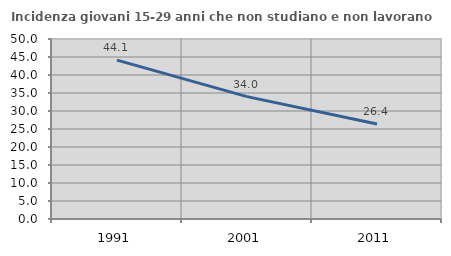
| Category | Incidenza giovani 15-29 anni che non studiano e non lavorano  |
|---|---|
| 1991.0 | 44.141 |
| 2001.0 | 33.992 |
| 2011.0 | 26.407 |